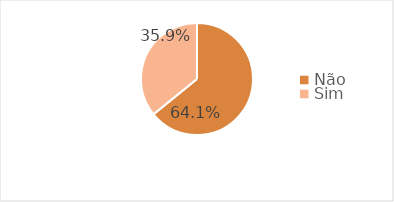
| Category | Series 0 |
|---|---|
| Não | 0.641 |
| Sim | 0.359 |